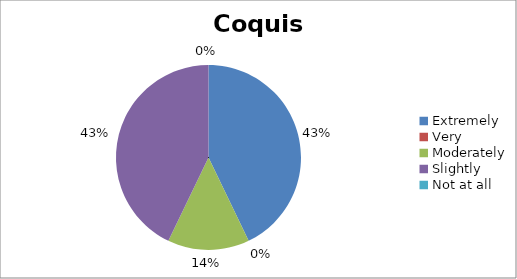
| Category | Coquis |
|---|---|
| Extremely | 3 |
| Very | 0 |
| Moderately | 1 |
| Slightly | 3 |
| Not at all | 0 |